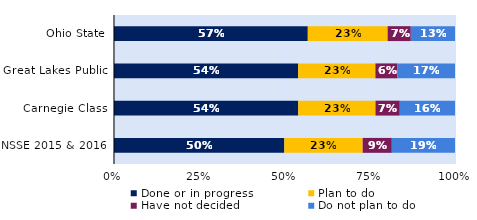
| Category | Done or in progress | Plan to do | Have not decided | Do not plan to do |
|---|---|---|---|---|
| Ohio State | 0.568 | 0.234 | 0.068 | 0.13 |
| Great Lakes Public | 0.54 | 0.227 | 0.065 | 0.169 |
| Carnegie Class | 0.54 | 0.227 | 0.071 | 0.162 |
| NSSE 2015 & 2016 | 0.499 | 0.23 | 0.085 | 0.185 |